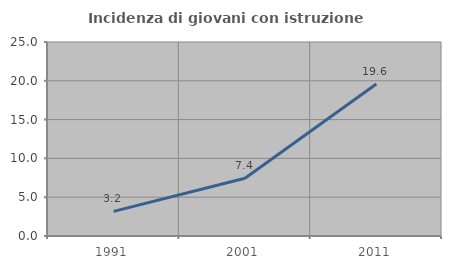
| Category | Incidenza di giovani con istruzione universitaria |
|---|---|
| 1991.0 | 3.175 |
| 2001.0 | 7.432 |
| 2011.0 | 19.58 |